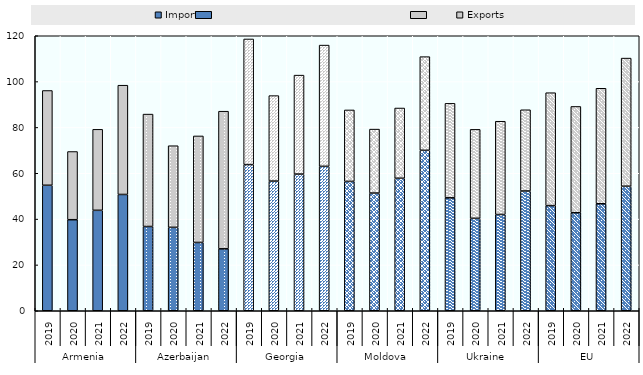
| Category | Imports | Exports |
|---|---|---|
| 0 | 54.763 | 41.351 |
| 1 | 39.724 | 29.765 |
| 2 | 43.831 | 35.336 |
| 3 | 50.747 | 47.68 |
| 4 | 36.768 | 49.051 |
| 5 | 36.394 | 35.624 |
| 6 | 29.798 | 46.489 |
| 7 | 27.025 | 60.053 |
| 8 | 63.781 | 54.818 |
| 9 | 56.584 | 37.291 |
| 10 | 59.634 | 43.187 |
| 11 | 63.026 | 52.898 |
| 12 | 56.441 | 31.191 |
| 13 | 51.351 | 27.914 |
| 14 | 57.822 | 30.649 |
| 15 | 70.003 | 40.882 |
| 16 | 49.28 | 41.232 |
| 17 | 40.335 | 38.822 |
| 18 | 42.01 | 40.688 |
| 19 | 52.25 | 35.457 |
| 20 | 45.87 | 49.281 |
| 21 | 42.773 | 46.386 |
| 22 | 46.687 | 50.399 |
| 23 | 54.346 | 55.91 |